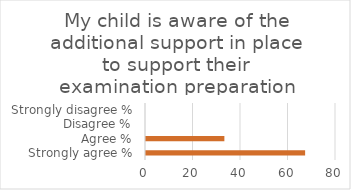
| Category | Series 1 |
|---|---|
| Strongly agree % | 67 |
| Agree % | 33 |
| Disagree % | 0 |
| Strongly disagree % | 0 |